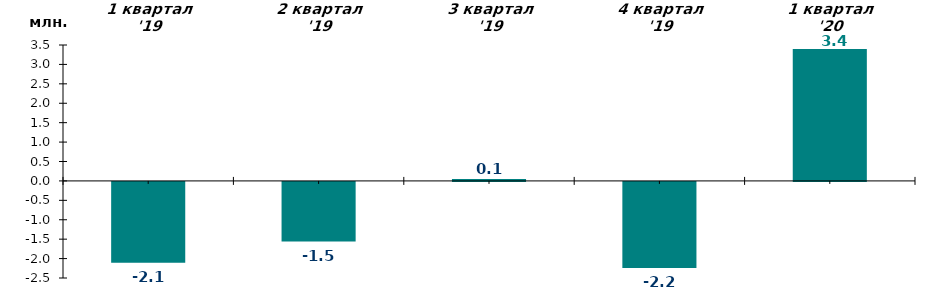
| Category | Чистий притік/відтік за відповідний квартал, млн. грн. |
|---|---|
| 1 квартал '19 | -2.084 |
| 2 квартал '19 | -1.537 |
| 3 квартал '19 | 0.051 |
| 4 квартал '19 | -2.217 |
| 1 квартал '20 | 3.4 |